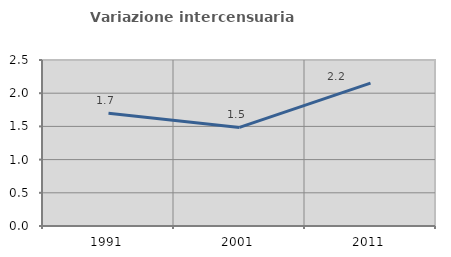
| Category | Variazione intercensuaria annua |
|---|---|
| 1991.0 | 1.697 |
| 2001.0 | 1.484 |
| 2011.0 | 2.152 |